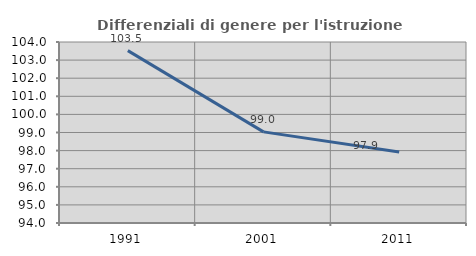
| Category | Differenziali di genere per l'istruzione superiore |
|---|---|
| 1991.0 | 103.522 |
| 2001.0 | 99.034 |
| 2011.0 | 97.918 |